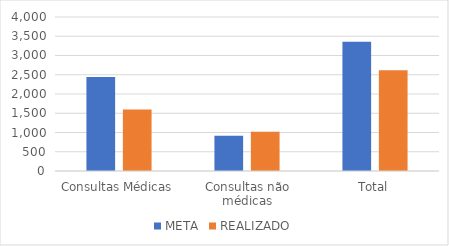
| Category | META | REALIZADO |
|---|---|---|
| Consultas Médicas | 2442 | 1600 |
| Consultas não médicas | 916 | 1020 |
| Total | 3358 | 2620 |